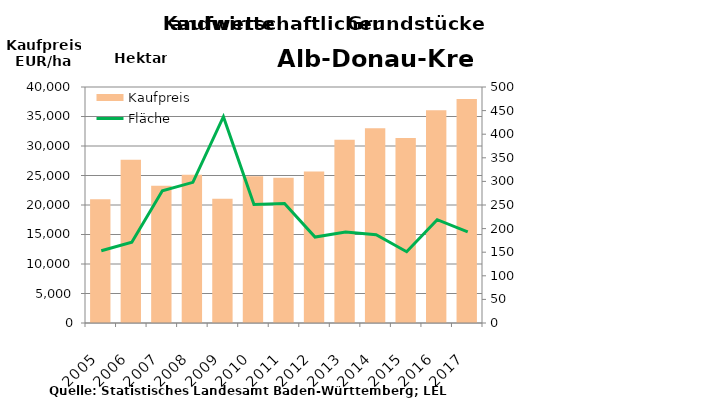
| Category | Kaufpreis |
|---|---|
| 2005.0 | 20964 |
| 2006.0 | 27665 |
| 2007.0 | 23281 |
| 2008.0 | 25116 |
| 2009.0 | 21046 |
| 2010.0 | 24867 |
| 2011.0 | 24598 |
| 2012.0 | 25670 |
| 2013.0 | 31043 |
| 2014.0 | 33010 |
| 2015.0 | 31369 |
| 2016.0 | 36074 |
| 2017.0 | 37954 |